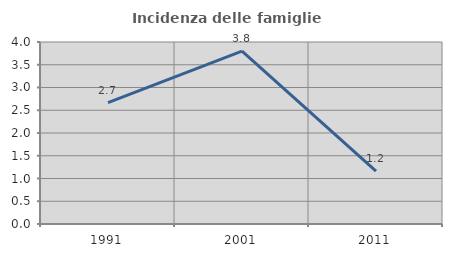
| Category | Incidenza delle famiglie numerose |
|---|---|
| 1991.0 | 2.667 |
| 2001.0 | 3.797 |
| 2011.0 | 1.163 |